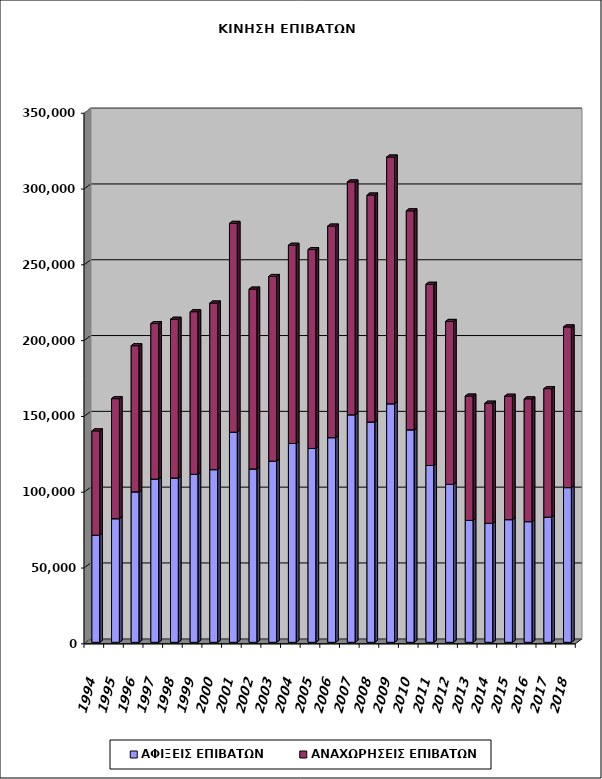
| Category | ΑΦΙΞΕΙΣ ΕΠΙΒΑΤΩΝ | ΑΝΑΧΩΡΗΣΕΙΣ ΕΠΙΒΑΤΩΝ |
|---|---|---|
| 1994.0 | 70668 | 68798 |
| 1995.0 | 81547 | 79173 |
| 1996.0 | 99252 | 96426 |
| 1997.0 | 107648 | 102615 |
| 1998.0 | 108400 | 104705 |
| 1999.0 | 110840 | 107228 |
| 2000.0 | 113909 | 109900 |
| 2001.0 | 138633 | 137721 |
| 2002.0 | 114356 | 118637 |
| 2003.0 | 119516 | 121807 |
| 2004.0 | 131155 | 130759 |
| 2005.0 | 127902 | 131187 |
| 2006.0 | 135000 | 139571 |
| 2007.0 | 150088 | 153602 |
| 2008.0 | 145352 | 149711 |
| 2009.0 | 157347 | 162756 |
| 2010.0 | 140196 | 144450 |
| 2011.0 | 116642 | 119532 |
| 2012.0 | 104197 | 107479 |
| 2013.0 | 80422 | 82011 |
| 2014.0 | 78506 | 79240 |
| 2015.0 | 80925 | 81410 |
| 2016.0 | 79603 | 81001 |
| 2017.0 | 82570 | 84754 |
| 2018.0 | 102057 | 105999 |